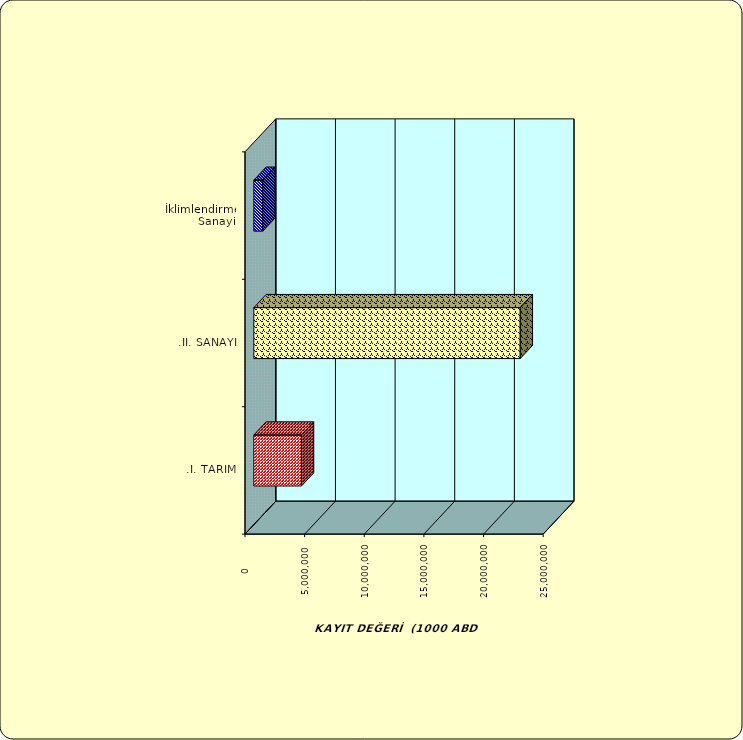
| Category | Series 0 |
|---|---|
| .I. TARIM | 3990889.173 |
| .II. SANAYİ | 22335494.21 |
|  İklimlendirme Sanayii | 750298.323 |